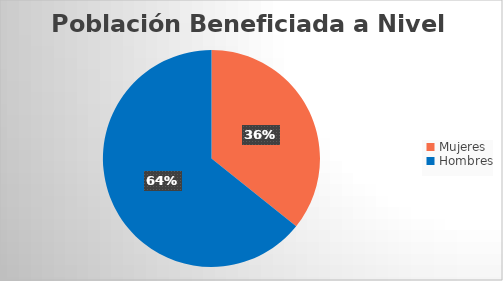
| Category | Series 0 |
|---|---|
| Mujeres | 1643 |
| Hombres | 2953 |